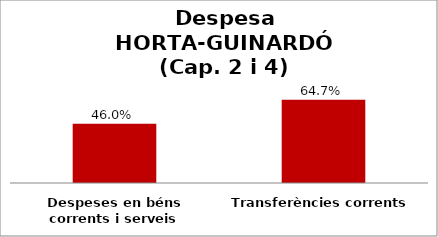
| Category | Series 0 |
|---|---|
| Despeses en béns corrents i serveis | 0.46 |
| Transferències corrents | 0.647 |